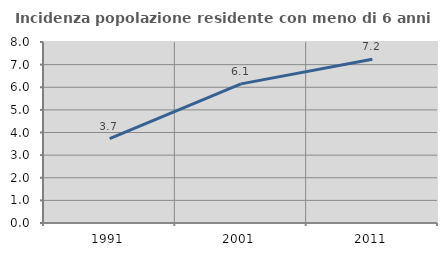
| Category | Incidenza popolazione residente con meno di 6 anni |
|---|---|
| 1991.0 | 3.731 |
| 2001.0 | 6.149 |
| 2011.0 | 7.24 |